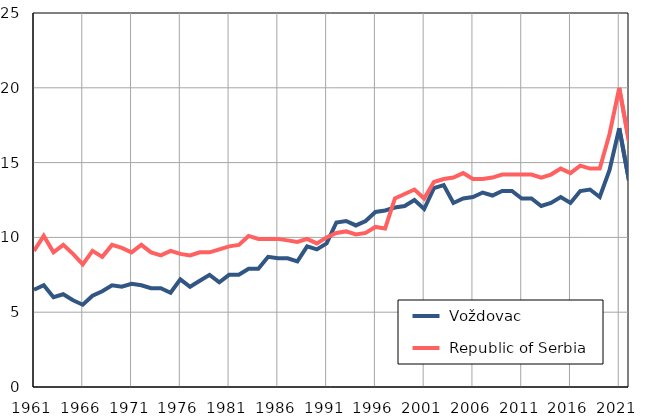
| Category |  Voždovac |  Republic of Serbia |
|---|---|---|
| 1961.0 | 6.5 | 9.1 |
| 1962.0 | 6.8 | 10.1 |
| 1963.0 | 6 | 9 |
| 1964.0 | 6.2 | 9.5 |
| 1965.0 | 5.8 | 8.9 |
| 1966.0 | 5.5 | 8.2 |
| 1967.0 | 6.1 | 9.1 |
| 1968.0 | 6.4 | 8.7 |
| 1969.0 | 6.8 | 9.5 |
| 1970.0 | 6.7 | 9.3 |
| 1971.0 | 6.9 | 9 |
| 1972.0 | 6.8 | 9.5 |
| 1973.0 | 6.6 | 9 |
| 1974.0 | 6.6 | 8.8 |
| 1975.0 | 6.3 | 9.1 |
| 1976.0 | 7.2 | 8.9 |
| 1977.0 | 6.7 | 8.8 |
| 1978.0 | 7.1 | 9 |
| 1979.0 | 7.5 | 9 |
| 1980.0 | 7 | 9.2 |
| 1981.0 | 7.5 | 9.4 |
| 1982.0 | 7.5 | 9.5 |
| 1983.0 | 7.9 | 10.1 |
| 1984.0 | 7.9 | 9.9 |
| 1985.0 | 8.7 | 9.9 |
| 1986.0 | 8.6 | 9.9 |
| 1987.0 | 8.6 | 9.8 |
| 1988.0 | 8.4 | 9.7 |
| 1989.0 | 9.4 | 9.9 |
| 1990.0 | 9.2 | 9.6 |
| 1991.0 | 9.6 | 10 |
| 1992.0 | 11 | 10.3 |
| 1993.0 | 11.1 | 10.4 |
| 1994.0 | 10.8 | 10.2 |
| 1995.0 | 11.1 | 10.3 |
| 1996.0 | 11.7 | 10.7 |
| 1997.0 | 11.8 | 10.6 |
| 1998.0 | 12 | 12.6 |
| 1999.0 | 12.1 | 12.9 |
| 2000.0 | 12.5 | 13.2 |
| 2001.0 | 11.9 | 12.6 |
| 2002.0 | 13.3 | 13.7 |
| 2003.0 | 13.5 | 13.9 |
| 2004.0 | 12.3 | 14 |
| 2005.0 | 12.6 | 14.3 |
| 2006.0 | 12.7 | 13.9 |
| 2007.0 | 13 | 13.9 |
| 2008.0 | 12.8 | 14 |
| 2009.0 | 13.1 | 14.2 |
| 2010.0 | 13.1 | 14.2 |
| 2011.0 | 12.6 | 14.2 |
| 2012.0 | 12.6 | 14.2 |
| 2013.0 | 12.1 | 14 |
| 2014.0 | 12.3 | 14.2 |
| 2015.0 | 12.7 | 14.6 |
| 2016.0 | 12.3 | 14.3 |
| 2017.0 | 13.1 | 14.8 |
| 2018.0 | 13.2 | 14.6 |
| 2019.0 | 12.7 | 14.6 |
| 2020.0 | 14.5 | 16.9 |
| 2021.0 | 17.3 | 20 |
| 2022.0 | 13.8 | 16.4 |